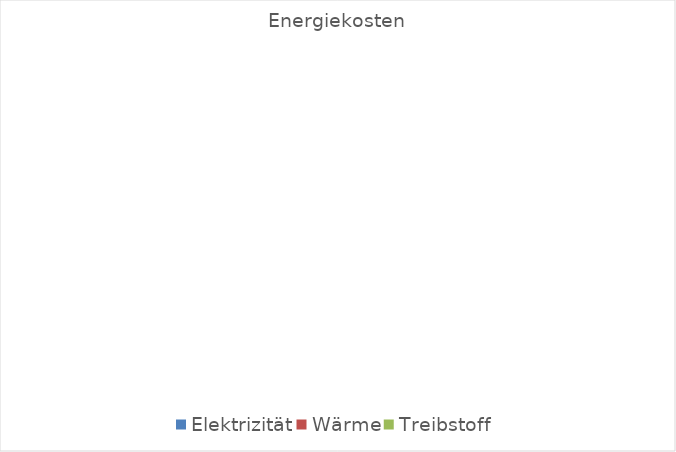
| Category | Series 0 |
|---|---|
| Elektrizität | 0 |
| Wärme | 0 |
| Treibstoff | 0 |